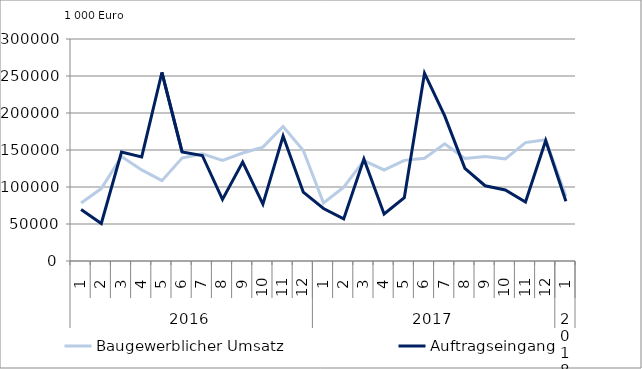
| Category | Baugewerblicher Umsatz | Auftragseingang |
|---|---|---|
| 0 | 78291.738 | 69470.357 |
| 1 | 97863.379 | 50640.033 |
| 2 | 141176.119 | 147206.65 |
| 3 | 123121.297 | 140579.009 |
| 4 | 108561.124 | 254739.334 |
| 5 | 139030.209 | 147481.644 |
| 6 | 144784.416 | 142609.658 |
| 7 | 135870.195 | 83192.156 |
| 8 | 145961.738 | 133594.351 |
| 9 | 153886.826 | 76793.838 |
| 10 | 181740.037 | 168867.568 |
| 11 | 149348.138 | 93011.853 |
| 12 | 78446.78 | 70908.903 |
| 13 | 99841.908 | 56868.408 |
| 14 | 135679.867 | 137790.423 |
| 15 | 123004.403 | 63637.761 |
| 16 | 136010.071 | 85644.63 |
| 17 | 138859.308 | 253791.552 |
| 18 | 158353.879 | 196034.198 |
| 19 | 138510.315 | 125319.873 |
| 20 | 141109.925 | 101690.626 |
| 21 | 138067.098 | 95966.626 |
| 22 | 160064.454 | 79701.993 |
| 23 | 163969.017 | 162878.607 |
| 24 | 87640.529 | 80684.627 |